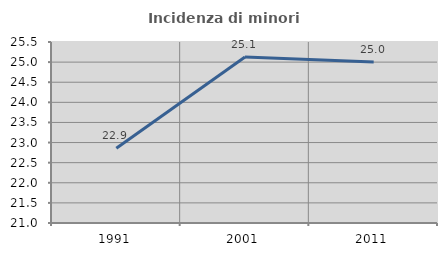
| Category | Incidenza di minori stranieri |
|---|---|
| 1991.0 | 22.857 |
| 2001.0 | 25.128 |
| 2011.0 | 25 |